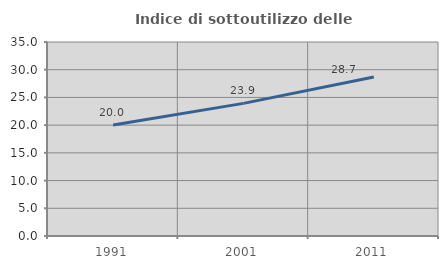
| Category | Indice di sottoutilizzo delle abitazioni  |
|---|---|
| 1991.0 | 20.014 |
| 2001.0 | 23.927 |
| 2011.0 | 28.702 |